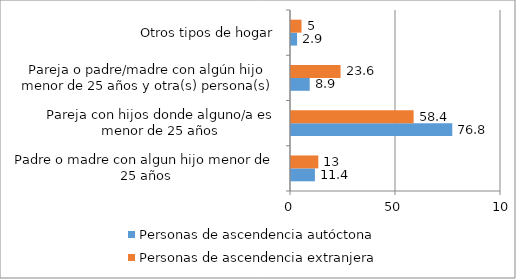
| Category | Personas de ascendencia autóctona | Personas de ascendencia extranjera |
|---|---|---|
| Padre o madre con algun hijo menor de 25 años | 11.4 | 13 |
| Pareja con hijos donde alguno/a es menor de 25 años | 76.8 | 58.4 |
| Pareja o padre/madre con algún hijo menor de 25 años y otra(s) persona(s) | 8.9 | 23.6 |
| Otros tipos de hogar | 2.9 | 5 |